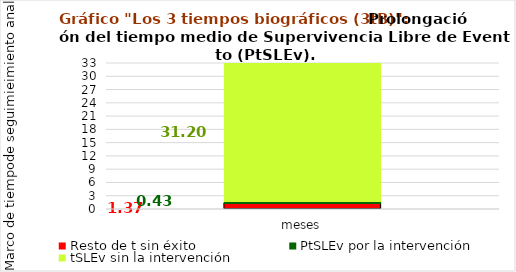
| Category | Resto de t sin éxito | PtSLEv por la intervención | tSLEv sin la intervención |
|---|---|---|---|
| meses | 1.372 | 0.425 | 31.203 |